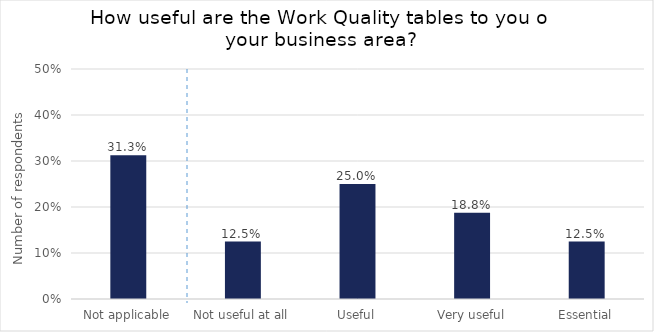
| Category | How useful are the Work Quality Tables to you or your business area? |
|---|---|
| Not applicable | 0.312 |
| Not useful at all | 0.125 |
| Useful | 0.25 |
| Very useful | 0.188 |
| Essential | 0.125 |